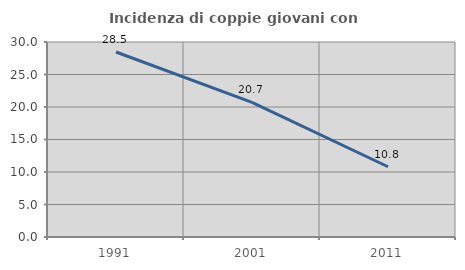
| Category | Incidenza di coppie giovani con figli |
|---|---|
| 1991.0 | 28.461 |
| 2001.0 | 20.699 |
| 2011.0 | 10.809 |